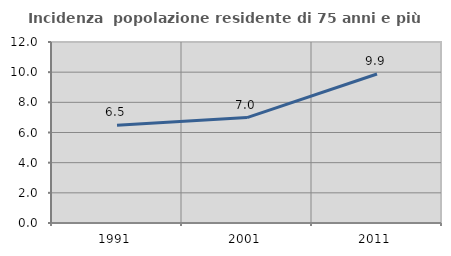
| Category | Incidenza  popolazione residente di 75 anni e più |
|---|---|
| 1991.0 | 6.486 |
| 2001.0 | 6.991 |
| 2011.0 | 9.879 |